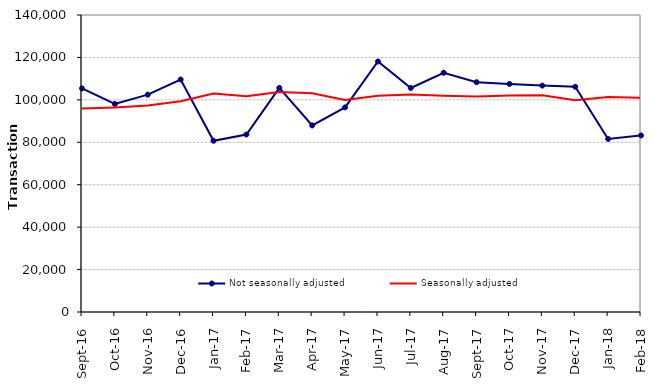
| Category | Not seasonally adjusted | Seasonally adjusted |
|---|---|---|
| 2016-09-01 | 105400 | 95900 |
| 2016-10-01 | 98070 | 96450 |
| 2016-11-01 | 102440 | 97320 |
| 2016-12-01 | 109600 | 99300 |
| 2017-01-01 | 80710 | 102960 |
| 2017-02-01 | 83670 | 101710 |
| 2017-03-01 | 105640 | 103720 |
| 2017-04-01 | 87950 | 103060 |
| 2017-05-01 | 96460 | 99940 |
| 2017-06-01 | 118080 | 101900 |
| 2017-07-01 | 105600 | 102480 |
| 2017-08-01 | 112790 | 101940 |
| 2017-09-01 | 108310 | 101640 |
| 2017-10-01 | 107510 | 102000 |
| 2017-11-01 | 106730 | 102120 |
| 2017-12-01 | 106170 | 99800 |
| 2018-01-01 | 81580 | 101350 |
| 2018-02-01 | 83230 | 101010 |